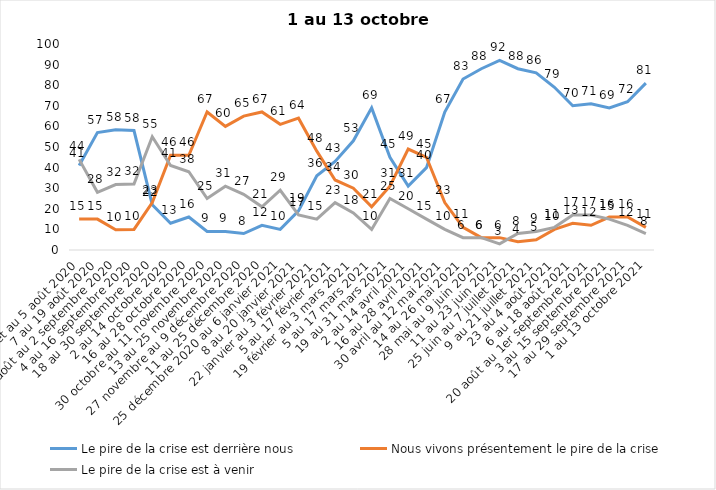
| Category | Le pire de la crise est derrière nous | Nous vivons présentement le pire de la crise | Le pire de la crise est à venir |
|---|---|---|---|
| 24 juillet au 5 août 2020 | 41 | 15 | 44 |
| 7 au 19 août 2020 | 57 | 15 | 28 |
| 21 août au 2 septembre 2020 | 58.39 | 9.84 | 31.77 |
| 4 au 16 septembre 2020 | 58 | 10 | 32 |
| 18 au 30 septembre 2020 | 22 | 23 | 55 |
| 2 au 14 octobre 2020 | 13 | 46 | 41 |
| 16 au 28 octobre 2020 | 16 | 46 | 38 |
| 30 octobre au 11 novembre 2020 | 9 | 67 | 25 |
| 13 au 25 novembre 2020 | 9 | 60 | 31 |
| 27 novembre au 9 décembre 2020 | 8 | 65 | 27 |
| 11 au 25 décembre 2020 | 12 | 67 | 21 |
| 25 décembre 2020 au 6 janvier 2021 | 10 | 61 | 29 |
| 8 au 20 janvier 2021 | 19 | 64 | 17 |
| 22 janvier au 3 février 2021 | 36 | 48 | 15 |
| 5 au 17 février 2021 | 43 | 34 | 23 |
| 19 février au 3 mars 2021 | 53 | 30 | 18 |
| 5 au 17 mars 2021 | 69 | 21 | 10 |
| 19 au 31 mars 2021 | 45 | 31 | 25 |
| 2 au 14 avril 2021 | 31 | 49 | 20 |
| 16 au 28 avril 2021 | 40 | 45 | 15 |
| 30 avril au 12 mai 2021 | 67 | 23 | 10 |
| 14 au 26 mai 2021 | 83 | 11 | 6 |
| 28 mai au 9 juin 2021 | 88 | 6 | 6 |
| 11 au 23 juin 2021 | 92 | 6 | 3 |
| 25 juin au 7 juillet 2021 | 88 | 4 | 8 |
| 9 au 21 juillet 2021 | 86 | 5 | 9 |
| 23 au 4 août 2021 | 79 | 10 | 11 |
| 6 au 18 août 2021 | 70 | 13 | 17 |
| 20 août au 1er septembre 2021 | 71 | 12 | 17 |
| 3 au 15 septembre 2021 | 69 | 16 | 15 |
| 17 au 29 septembre 2021 | 72 | 16 | 12 |
| 1 au 13 octobre 2021 | 81 | 11 | 8 |